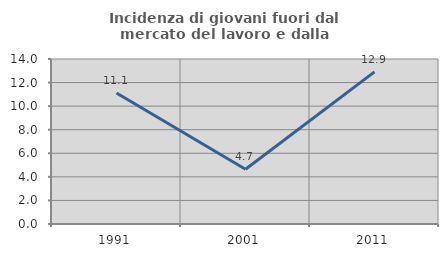
| Category | Incidenza di giovani fuori dal mercato del lavoro e dalla formazione  |
|---|---|
| 1991.0 | 11.111 |
| 2001.0 | 4.651 |
| 2011.0 | 12.903 |